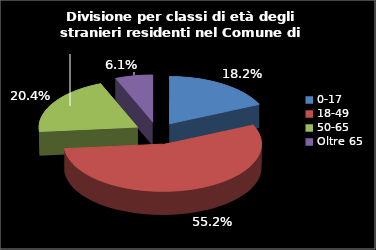
| Category | Series 0 |
|---|---|
| 0-17 | 276 |
| 18-49 | 836 |
| 50-65 | 309 |
| Oltre 65 | 93 |